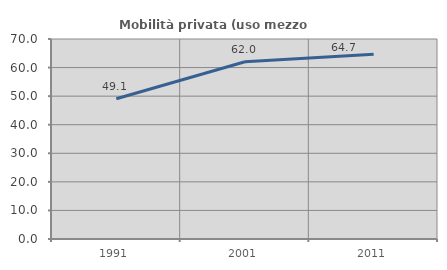
| Category | Mobilità privata (uso mezzo privato) |
|---|---|
| 1991.0 | 49.099 |
| 2001.0 | 62.019 |
| 2011.0 | 64.693 |